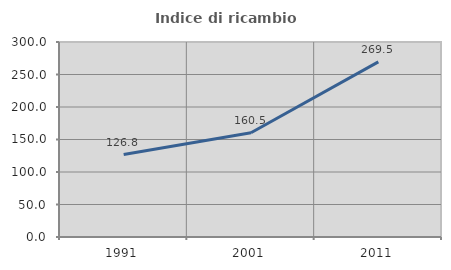
| Category | Indice di ricambio occupazionale  |
|---|---|
| 1991.0 | 126.765 |
| 2001.0 | 160.456 |
| 2011.0 | 269.458 |